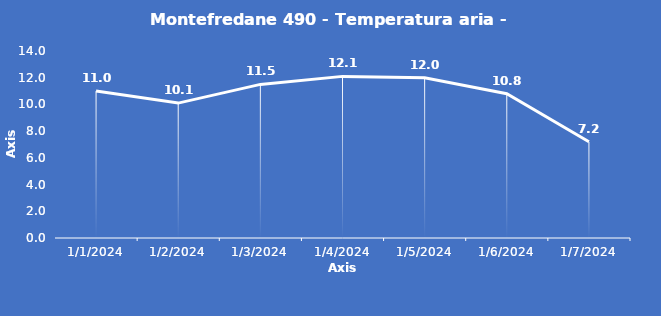
| Category | Montefredane 490 - Temperatura aria - Grezzo (°C) |
|---|---|
| 1/1/24 | 11 |
| 1/2/24 | 10.1 |
| 1/3/24 | 11.5 |
| 1/4/24 | 12.1 |
| 1/5/24 | 12 |
| 1/6/24 | 10.8 |
| 1/7/24 | 7.2 |